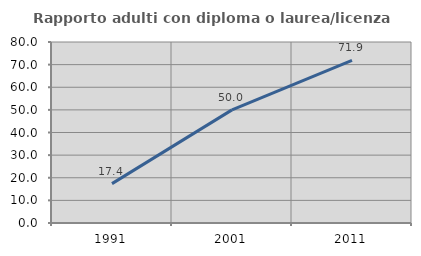
| Category | Rapporto adulti con diploma o laurea/licenza media  |
|---|---|
| 1991.0 | 17.391 |
| 2001.0 | 50 |
| 2011.0 | 71.875 |